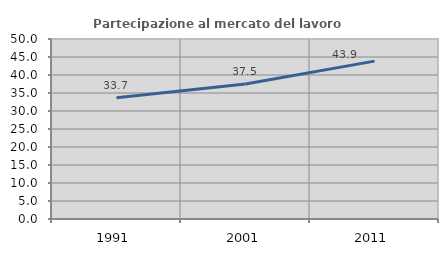
| Category | Partecipazione al mercato del lavoro  femminile |
|---|---|
| 1991.0 | 33.709 |
| 2001.0 | 37.516 |
| 2011.0 | 43.86 |